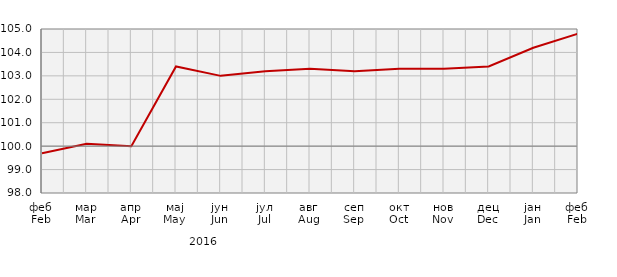
| Category | Индекси цијена произвођача
Producer price indices |
|---|---|
| феб
Feb | 99.7 |
| мар
Mar | 100.1 |
| апр
Apr | 100 |
| мај
May | 103.4 |
| јун
Jun | 103 |
| јул
Jul | 103.2 |
| авг
Aug | 103.3 |
| сеп
Sep | 103.2 |
| окт
Oct | 103.3 |
| нов
Nov | 103.3 |
| дец
Dec | 103.4 |
| јан
Jan | 104.2 |
| феб
Feb | 104.8 |